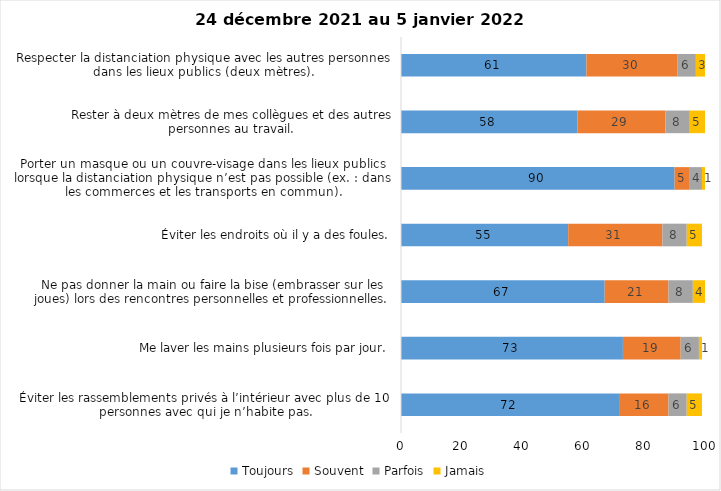
| Category | Toujours | Souvent | Parfois | Jamais |
|---|---|---|---|---|
| Éviter les rassemblements privés à l’intérieur avec plus de 10 personnes avec qui je n’habite pas. | 72 | 16 | 6 | 5 |
| Me laver les mains plusieurs fois par jour. | 73 | 19 | 6 | 1 |
| Ne pas donner la main ou faire la bise (embrasser sur les joues) lors des rencontres personnelles et professionnelles. | 67 | 21 | 8 | 4 |
| Éviter les endroits où il y a des foules. | 55 | 31 | 8 | 5 |
| Porter un masque ou un couvre-visage dans les lieux publics lorsque la distanciation physique n’est pas possible (ex. : dans les commerces et les transports en commun). | 90 | 5 | 4 | 1 |
| Rester à deux mètres de mes collègues et des autres personnes au travail. | 58 | 29 | 8 | 5 |
| Respecter la distanciation physique avec les autres personnes dans les lieux publics (deux mètres). | 61 | 30 | 6 | 3 |